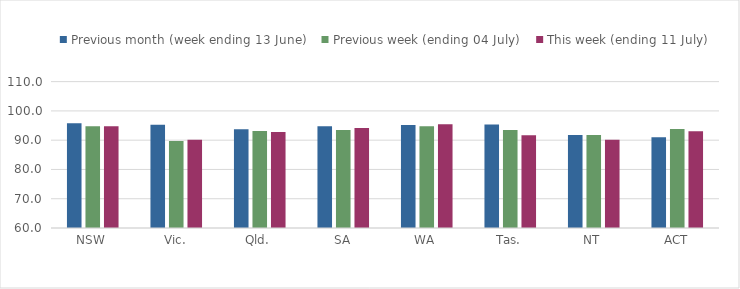
| Category | Previous month (week ending 13 June) | Previous week (ending 04 July) | This week (ending 11 July) |
|---|---|---|---|
| NSW | 95.782 | 94.759 | 94.77 |
| Vic. | 95.309 | 89.727 | 90.11 |
| Qld. | 93.714 | 93.168 | 92.754 |
| SA | 94.722 | 93.498 | 94.189 |
| WA | 95.21 | 94.799 | 95.459 |
| Tas. | 95.326 | 93.436 | 91.704 |
| NT | 91.729 | 91.729 | 90.113 |
| ACT | 90.979 | 93.839 | 93.023 |